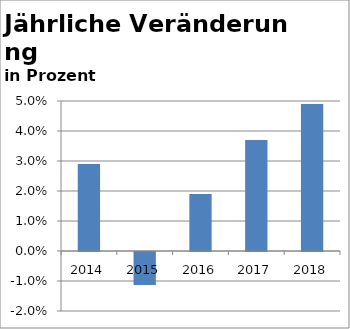
| Category | Series 0 |
|---|---|
| 2014.0 | 0.029 |
| 2015.0 | -0.011 |
| 2016.0 | 0.019 |
| 2017.0 | 0.037 |
| 2018.0 | 0.049 |